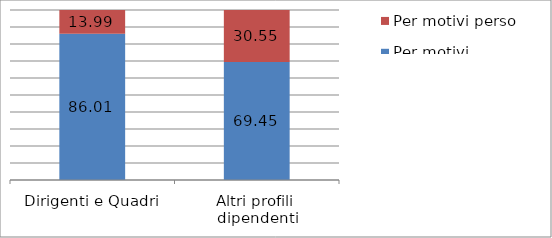
| Category | Per motivi professionali | Per motivi personali |
|---|---|---|
| Dirigenti e Quadri | 86.006 | 13.994 |
| Altri profili  dipendenti | 69.452 | 30.548 |